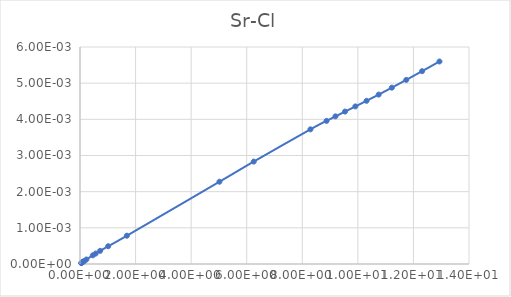
| Category | Series 0 |
|---|---|
| 0.045799 | 0 |
| 0.050887 | 0 |
| 0.057259 | 0 |
| 0.065457 | 0 |
| 0.076371 | 0 |
| 0.091686 | 0 |
| 0.11463 | 0 |
| 0.15299 | 0 |
| 0.22971 | 0 |
| 0.46165 | 0 |
| 0.56409 | 0 |
| 0.72494 | 0 |
| 1.0141 | 0 |
| 1.6871 | 0.001 |
| 5.0184 | 0.002 |
| 6.2531 | 0.003 |
| 8.2936 | 0.004 |
| 8.8726 | 0.004 |
| 9.1936 | 0.004 |
| 9.5386 | 0.004 |
| 9.9106 | 0.004 |
| 10.313 | 0.005 |
| 10.749 | 0.005 |
| 11.223 | 0.005 |
| 11.742 | 0.005 |
| 12.311 | 0.005 |
| 12.937 | 0.006 |